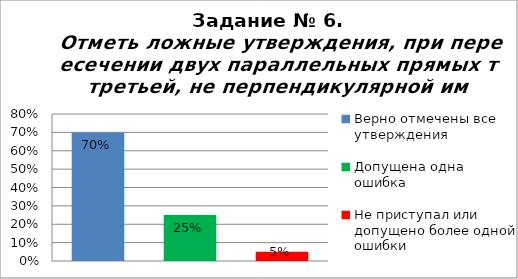
| Category | Отметь ложные утверждения, при пересечении двух параллельных прямых третьей, не перпендикулярной им. |
|---|---|
| Верно отмечены все утверждения | 0.7 |
| Допущена одна ошибка | 0.25 |
| Не приступал или допущено более одной ошибки | 0.05 |